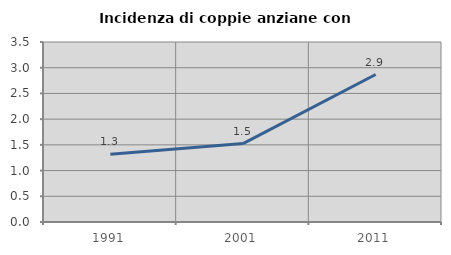
| Category | Incidenza di coppie anziane con figli |
|---|---|
| 1991.0 | 1.316 |
| 2001.0 | 1.524 |
| 2011.0 | 2.867 |